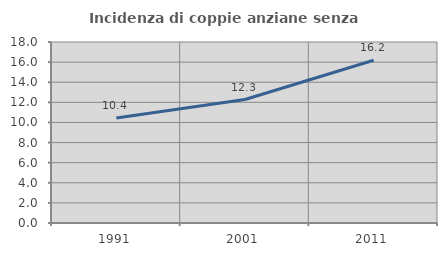
| Category | Incidenza di coppie anziane senza figli  |
|---|---|
| 1991.0 | 10.436 |
| 2001.0 | 12.277 |
| 2011.0 | 16.179 |